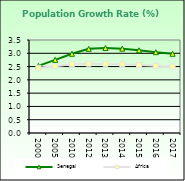
| Category | Senegal | Africa  |
|---|---|---|
| 2000.0 | 2.526 | 2.458 |
| 2005.0 | 2.754 | 2.516 |
| 2010.0 | 2.982 | 2.59 |
| 2012.0 | 3.168 | 2.606 |
| 2013.0 | 3.2 | 2.601 |
| 2014.0 | 3.175 | 2.584 |
| 2015.0 | 3.113 | 2.559 |
| 2016.0 | 3.042 | 2.531 |
| 2017.0 | 2.981 | 2.503 |